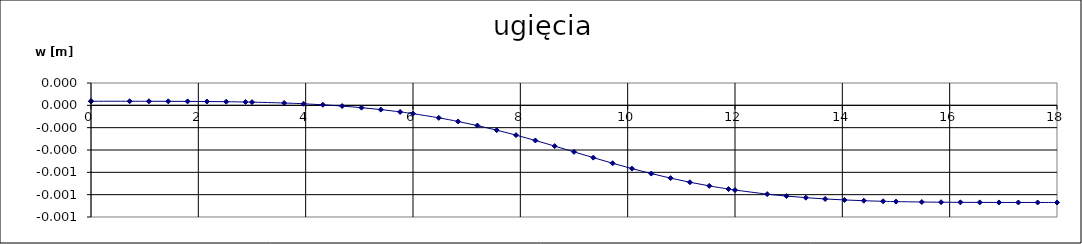
| Category | ugięcia |
|---|---|
| 0.0 | 0 |
| 0.001 | 0 |
| 0.72 | 0 |
| 1.08 | 0 |
| 1.44 | 0 |
| 1.7999999999999998 | 0 |
| 2.16 | 0 |
| 2.52 | 0 |
| 2.88 | 0 |
| 3.0 | 0 |
| 3.5999999999999996 | 0 |
| 3.96 | 0 |
| 4.32 | 0 |
| 4.68 | 0 |
| 5.04 | 0 |
| 5.3999999999999995 | 0 |
| 5.76 | 0 |
| 6.0 | 0 |
| 6.4799999999999995 | 0 |
| 6.84 | 0 |
| 7.199999999999999 | 0 |
| 7.56 | 0 |
| 7.92 | 0 |
| 8.28 | 0 |
| 8.64 | 0 |
| 9.0 | 0 |
| 9.36 | 0 |
| 9.719999999999999 | -0.001 |
| 10.08 | -0.001 |
| 10.44 | -0.001 |
| 10.799999999999999 | -0.001 |
| 11.16 | -0.001 |
| 11.52 | -0.001 |
| 11.879999999999999 | -0.001 |
| 12.0 | -0.001 |
| 12.6 | -0.001 |
| 12.959999999999999 | -0.001 |
| 13.32 | -0.001 |
| 13.68 | -0.001 |
| 14.04 | -0.001 |
| 14.399999999999999 | -0.001 |
| 14.76 | -0.001 |
| 15.0 | -0.001 |
| 15.479999999999999 | -0.001 |
| 15.84 | -0.001 |
| 16.2 | -0.001 |
| 16.56 | -0.001 |
| 16.919999999999998 | -0.001 |
| 17.28 | -0.001 |
| 17.64 | -0.001 |
| 18.0 | -0.001 |